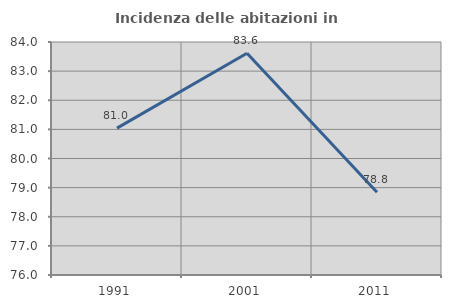
| Category | Incidenza delle abitazioni in proprietà  |
|---|---|
| 1991.0 | 81.044 |
| 2001.0 | 83.614 |
| 2011.0 | 78.844 |